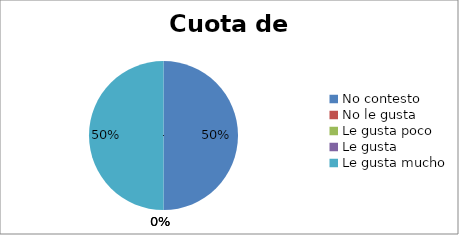
| Category | Series 0 |
|---|---|
| No contesto | 3 |
| No le gusta | 0 |
| Le gusta poco | 0 |
| Le gusta | 0 |
| Le gusta mucho | 3 |